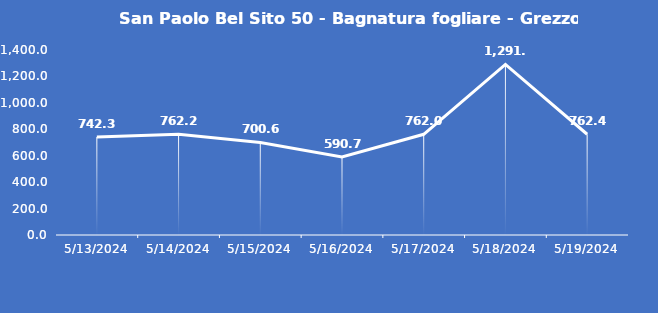
| Category | San Paolo Bel Sito 50 - Bagnatura fogliare - Grezzo (min) |
|---|---|
| 5/13/24 | 742.3 |
| 5/14/24 | 762.2 |
| 5/15/24 | 700.6 |
| 5/16/24 | 590.7 |
| 5/17/24 | 762 |
| 5/18/24 | 1291.3 |
| 5/19/24 | 762.4 |